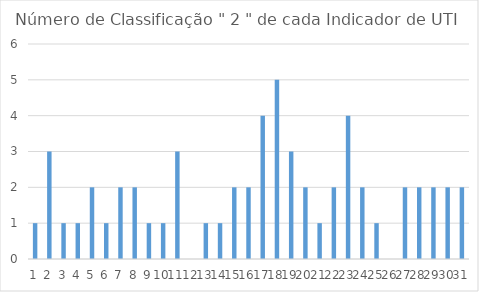
| Category | Series 0 |
|---|---|
| 0 | 1 |
| 1 | 3 |
| 2 | 1 |
| 3 | 1 |
| 4 | 2 |
| 5 | 1 |
| 6 | 2 |
| 7 | 2 |
| 8 | 1 |
| 9 | 1 |
| 10 | 3 |
| 11 | 0 |
| 12 | 1 |
| 13 | 1 |
| 14 | 2 |
| 15 | 2 |
| 16 | 4 |
| 17 | 5 |
| 18 | 3 |
| 19 | 2 |
| 20 | 1 |
| 21 | 2 |
| 22 | 4 |
| 23 | 2 |
| 24 | 1 |
| 25 | 0 |
| 26 | 2 |
| 27 | 2 |
| 28 | 2 |
| 29 | 2 |
| 30 | 2 |